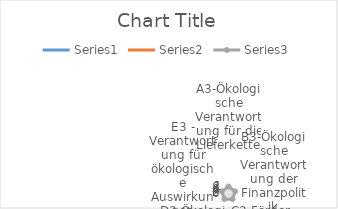
| Category | Series 0 | Series 1 | Series 2 |
|---|---|---|---|
| A3-Ökologische Verantwortung für die Lieferkette  | 0 | 0 | 10 |
| B3-Ökologische Verantwortung der Finanzpolitik | 0 | 0 | 10 |
| C3-Förderung ökologischen Verhaltens | 0 | 0 | 10 |
| D3-Ökologische Gestaltung von öffentlichen Leistungen | 0 | 0 | 10 |
| E3 - Verantwortung für ökologische Auswirkungen | 0 | 0 | 10 |